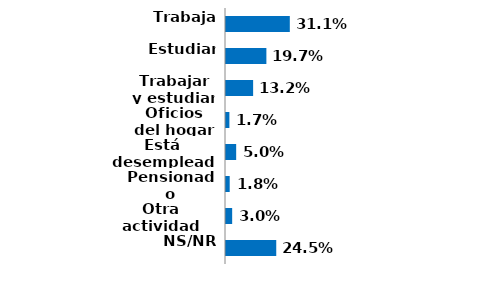
| Category | Series 0 |
|---|---|
| Trabaja | 0.311 |
| Estudiar | 0.197 |
| Trabajar y estudiar | 0.132 |
| Oficios del hogar | 0.017 |
| Está desempleado | 0.05 |
| Pensionado | 0.018 |
| Otra actividad | 0.03 |
| NS/NR | 0.245 |